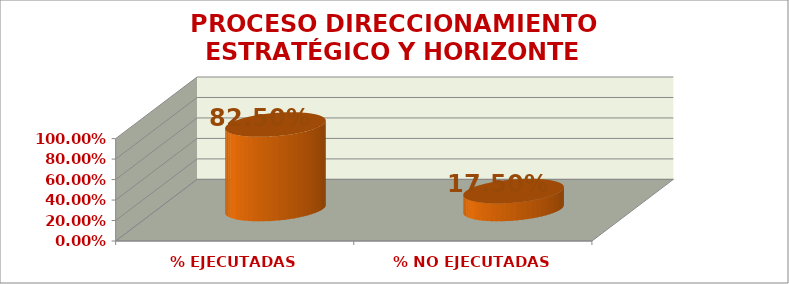
| Category | DIRECCIONAMIENTO ESTRATÉGICO Y HORIZONTE INSTITUCIONAL |
|---|---|
| % EJECUTADAS | 0.825 |
| % NO EJECUTADAS | 0.175 |